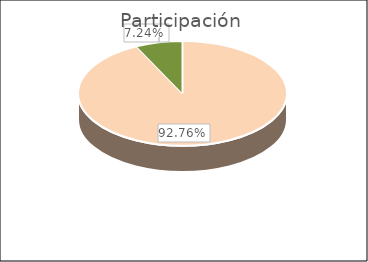
| Category | Participación |
|---|---|
| TI - Trámite Inmediato | 0.928 |
| TNI - Trámite No Inmediato | 0.072 |